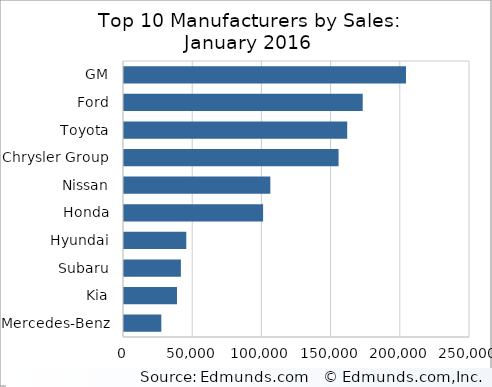
| Category | Series 0 |
|---|---|
| GM | 203745 |
| Ford | 172478 |
| Toyota | 161283 |
| Chrysler Group | 155037 |
| Nissan | 105734 |
| Honda | 100497 |
| Hyundai | 45011 |
| Subaru | 41101 |
| Kia | 38305 |
| Mercedes-Benz | 26962 |